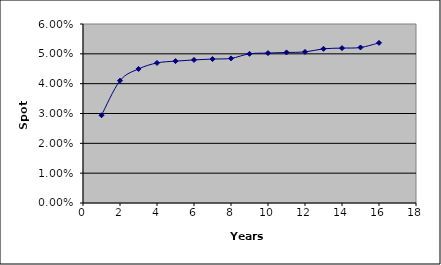
| Category | Series 0 |
|---|---|
| 0 | 0.029 |
| 1 | 0.041 |
| 2 | 0.045 |
| 3 | 0.047 |
| 4 | 0.048 |
| 5 | 0.048 |
| 6 | 0.048 |
| 7 | 0.048 |
| 8 | 0.05 |
| 9 | 0.05 |
| 10 | 0.05 |
| 11 | 0.051 |
| 12 | 0.052 |
| 13 | 0.052 |
| 14 | 0.052 |
| 15 | 0.054 |